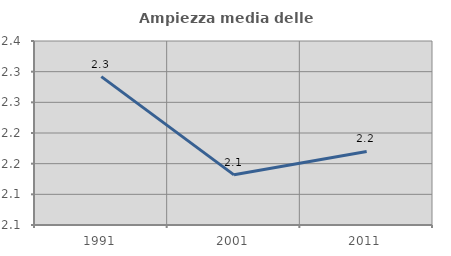
| Category | Ampiezza media delle famiglie |
|---|---|
| 1991.0 | 2.292 |
| 2001.0 | 2.132 |
| 2011.0 | 2.17 |